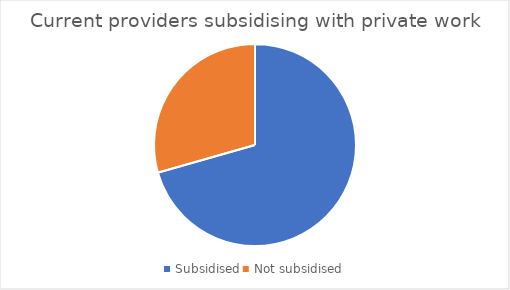
| Category | Series 0 |
|---|---|
| Subsidised | 12 |
| Not subsidised | 5 |